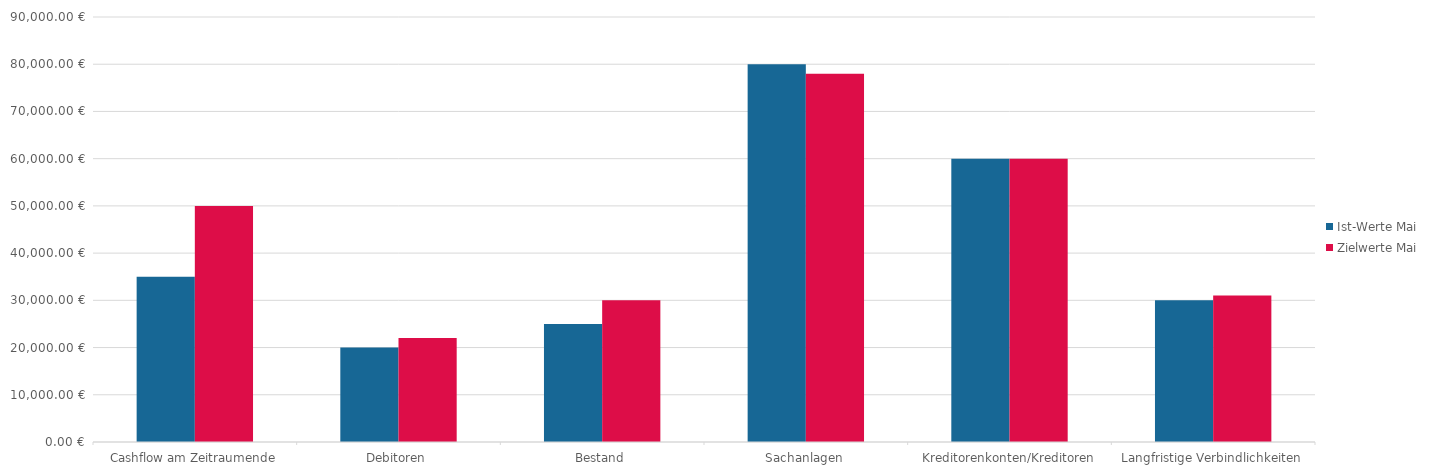
| Category | Ist-Werte Mai | Zielwerte Mai |
|---|---|---|
| Cashflow am Zeitraumende | 35000 | 50000 |
| Debitoren | 20000 | 22000 |
| Bestand | 25000 | 30000 |
| Sachanlagen | 80000 | 78000 |
| Kreditorenkonten/Kreditoren | 60000 | 60000 |
| Langfristige Verbindlichkeiten | 30000 | 31000 |